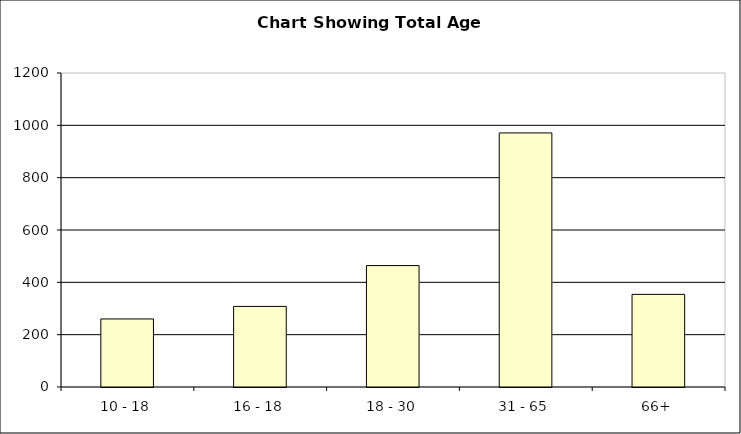
| Category | Total |
|---|---|
| 10 - 18 | 260 |
| 16 - 18 | 308 |
| 18 - 30 | 464 |
| 31 - 65 | 971 |
| 66+ | 354 |